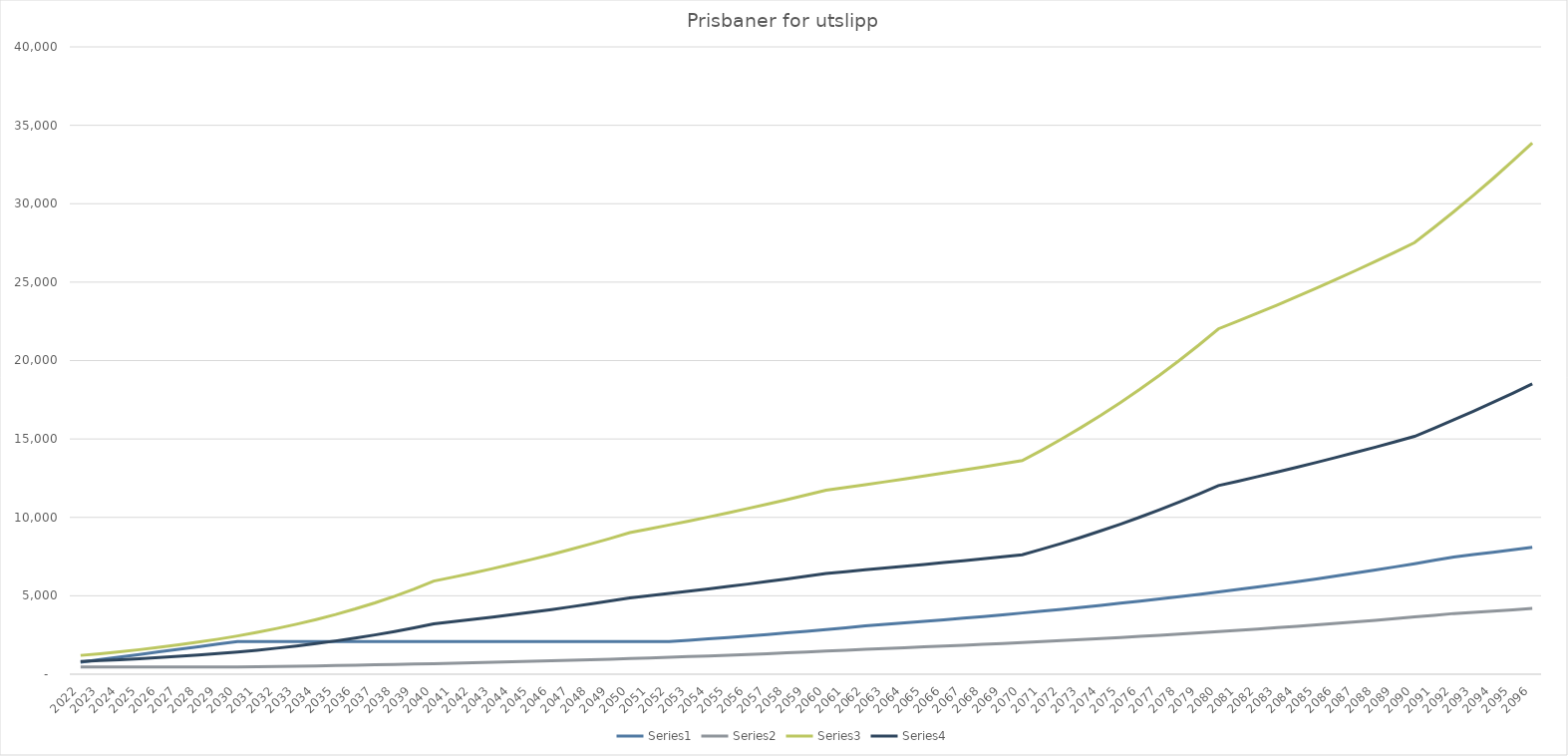
| Category | Series 6 | Series 7 | Series 8 | Series 9 | Series 0 | Series 1 | Series 2 | Series 3 | Series 4 | Series 5 |
|---|---|---|---|---|---|---|---|---|---|---|
| 2022.0 | 766 | 461 | 1200 | 817.497 |  |  |  |  |  |  |
| 2023.0 | 931 | 457 | 1311 | 868.973 |  |  |  |  |  |  |
| 2024.0 | 1095 | 455 | 1433 | 926.791 |  |  |  |  |  |  |
| 2025.0 | 1260 | 454 | 1566 | 990.434 |  |  |  |  |  |  |
| 2026.0 | 1424 | 455 | 1711 | 1060.9 |  |  |  |  |  |  |
| 2027.0 | 1589 | 455 | 1870 | 1137.602 |  |  |  |  |  |  |
| 2028.0 | 1754 | 455 | 2044 | 1221.541 |  |  |  |  |  |  |
| 2029.0 | 1918 | 455 | 2233 | 1312.715 |  |  |  |  |  |  |
| 2030.0 | 2083 | 455 | 2441 | 1413.055 |  |  |  |  |  |  |
| 2031.0 | 2083 | 473 | 2668 | 1531.878 |  |  |  |  |  |  |
| 2032.0 | 2083 | 492 | 2916 | 1661.348 |  |  |  |  |  |  |
| 2033.0 | 2083 | 511 | 3187 | 1801.914 |  |  |  |  |  |  |
| 2034.0 | 2083 | 532 | 3484 | 1956.058 |  |  |  |  |  |  |
| 2035.0 | 2083 | 553 | 3808 | 2123.226 |  |  |  |  |  |  |
| 2036.0 | 2083 | 575 | 4162 | 2305.385 |  |  |  |  |  |  |
| 2037.0 | 2083 | 598 | 4549 | 2503.98 |  |  |  |  |  |  |
| 2038.0 | 2083 | 622 | 4972 | 2720.459 |  |  |  |  |  |  |
| 2039.0 | 2083 | 647 | 5435 | 2956.752 |  |  |  |  |  |  |
| 2040.0 | 2083 | 673 | 5940 | 3213.824 |  |  |  |  |  |  |
| 2041.0 | 2083 | 700 | 6194 | 3350.33 |  |  |  |  |  |  |
| 2042.0 | 2083 | 728 | 6459 | 3492.66 |  |  |  |  |  |  |
| 2043.0 | 2083 | 757 | 6735 | 3640.813 |  |  |  |  |  |  |
| 2044.0 | 2083 | 787 | 7023 | 3795.274 |  |  |  |  |  |  |
| 2045.0 | 2083 | 819 | 7323 | 3956.558 |  |  |  |  |  |  |
| 2046.0 | 2083 | 852 | 7636 | 4124.631 |  |  |  |  |  |  |
| 2047.0 | 2083 | 886 | 7963 | 4299.976 |  |  |  |  |  |  |
| 2048.0 | 2083 | 921 | 8304 | 4482.592 |  |  |  |  |  |  |
| 2049.0 | 2083 | 958 | 8659 | 4672.996 |  |  |  |  |  |  |
| 2050.0 | 2083 | 996 | 9029 | 4871.155 |  |  |  |  |  |  |
| 2051.0 | 2083 | 1036 | 9268 | 5007.153 |  |  |  |  |  |  |
| 2052.0 | 2083 | 1077 | 9514 | 5147.046 |  |  |  |  |  |  |
| 2053.0 | 2165 | 1121 | 9766 | 5291.386 |  |  |  |  |  |  |
| 2054.0 | 2251 | 1165 | 10025 | 5439.103 |  |  |  |  |  |  |
| 2055.0 | 2341 | 1212 | 10291 | 5591.75 |  |  |  |  |  |  |
| 2056.0 | 2435 | 1260 | 10563 | 5747.808 |  |  |  |  |  |  |
| 2057.0 | 2532 | 1311 | 10843 | 5909.279 |  |  |  |  |  |  |
| 2058.0 | 2634 | 1363 | 11131 | 6075.126 |  |  |  |  |  |  |
| 2059.0 | 2739 | 1418 | 11426 | 6245.903 |  |  |  |  |  |  |
| 2060.0 | 2848 | 1475 | 11729 | 6421.575 |  |  |  |  |  |  |
| 2061.0 | 2962 | 1534 | 11905 | 6537.016 |  |  |  |  |  |  |
| 2062.0 | 3081 | 1595 | 12085 | 6655.422 |  |  |  |  |  |  |
| 2063.0 | 3173 | 1643 | 12266 | 6767.582 |  |  |  |  |  |  |
| 2064.0 | 3269 | 1692 | 12451 | 6882.189 |  |  |  |  |  |  |
| 2065.0 | 3367 | 1743 | 12639 | 6999.278 |  |  |  |  |  |  |
| 2066.0 | 3468 | 1795 | 12829 | 7117.85 |  |  |  |  |  |  |
| 2067.0 | 3572 | 1849 | 13022 | 7238.904 |  |  |  |  |  |  |
| 2068.0 | 3679 | 1904 | 13218 | 7361.923 |  |  |  |  |  |  |
| 2069.0 | 3789 | 1962 | 13417 | 7487.942 |  |  |  |  |  |  |
| 2070.0 | 3903 | 2020 | 13619 | 7615.409 |  |  |  |  |  |  |
| 2071.0 | 4020 | 2081 | 14289 | 7970.193 |  |  |  |  |  |  |
| 2072.0 | 4140 | 2143 | 14993 | 8341.896 |  |  |  |  |  |  |
| 2073.0 | 4265 | 2208 | 15731 | 8731.555 |  |  |  |  |  |  |
| 2074.0 | 4393 | 2274 | 16505 | 9139.097 |  |  |  |  |  |  |
| 2075.0 | 4524 | 2342 | 17318 | 9566.488 |  |  |  |  |  |  |
| 2076.0 | 4660 | 2412 | 18170 | 10013.728 |  |  |  |  |  |  |
| 2077.0 | 4800 | 2485 | 19065 | 10483.265 |  |  |  |  |  |  |
| 2078.0 | 4944 | 2559 | 20003 | 10974.062 |  |  |  |  |  |  |
| 2079.0 | 5092 | 2636 | 20988 | 11489.085 |  |  |  |  |  |  |
| 2080.0 | 5245 | 2715 | 22021 | 12028.299 |  |  |  |  |  |  |
| 2081.0 | 5402 | 2797 | 22517 | 12310.015 |  |  |  |  |  |  |
| 2082.0 | 5564 | 2881 | 23025 | 12598.554 |  |  |  |  |  |  |
| 2083.0 | 5731 | 2967 | 23544 | 12893.435 |  |  |  |  |  |  |
| 2084.0 | 5903 | 3056 | 24074 | 13195.176 |  |  |  |  |  |  |
| 2085.0 | 6080 | 3148 | 24617 | 13504.74 |  |  |  |  |  |  |
| 2086.0 | 6263 | 3242 | 25172 | 13821.128 |  |  |  |  |  |  |
| 2087.0 | 6451 | 3339 | 25739 | 14144.858 |  |  |  |  |  |  |
| 2088.0 | 6644 | 3440 | 26319 | 14476.93 |  |  |  |  |  |  |
| 2089.0 | 6844 | 3543 | 26912 | 14816.308 |  |  |  |  |  |  |
| 2090.0 | 7049 | 3649 | 27518 | 15163.511 |  |  |  |  |  |  |
| 2091.0 | 7260 | 3759 | 28488 | 15688.378 |  |  |  |  |  |  |
| 2092.0 | 7478 | 3871 | 29491 | 16230.201 |  |  |  |  |  |  |
| 2093.0 | 7628 | 3949 | 30530 | 16771.791 |  |  |  |  |  |  |
| 2094.0 | 7780 | 4028 | 31605 | 17331.266 |  |  |  |  |  |  |
| 2095.0 | 7936 | 4108 | 32719 | 17910.072 |  |  |  |  |  |  |
| 2096.0 | 8095 | 4190 | 33871 | 18508.245 |  |  |  |  |  |  |